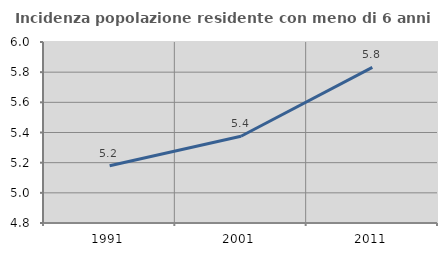
| Category | Incidenza popolazione residente con meno di 6 anni |
|---|---|
| 1991.0 | 5.179 |
| 2001.0 | 5.375 |
| 2011.0 | 5.831 |